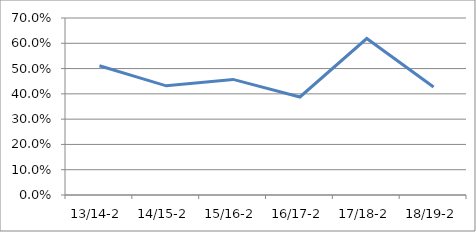
| Category | Series 0 |
|---|---|
| 13/14-2 | 0.511 |
| 14/15-2 | 0.432 |
| 15/16-2 | 0.457 |
| 16/17-2 | 0.388 |
| 17/18-2 | 0.619 |
| 18/19-2 | 0.427 |